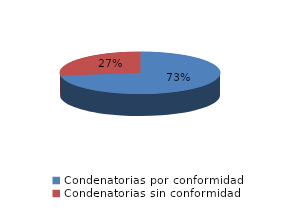
| Category | Series 0 |
|---|---|
| 0 | 997 |
| 1 | 374 |